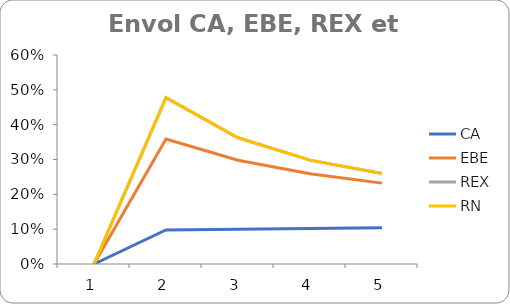
| Category | CA | EBE | REX | RN |
|---|---|---|---|---|
| 0 | 0 | 0 | 0 | 0 |
| 1 | 0.098 | 0.359 | 0.478 | 0.478 |
| 2 | 0.1 | 0.298 | 0.362 | 0.362 |
| 3 | 0.102 | 0.259 | 0.298 | 0.298 |
| 4 | 0.104 | 0.232 | 0.26 | 0.26 |